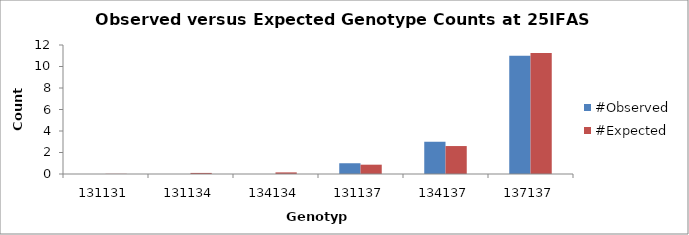
| Category | #Observed | #Expected |
|---|---|---|
| 131131.0 | 0 | 0.017 |
| 131134.0 | 0 | 0.1 |
| 134134.0 | 0 | 0.15 |
| 131137.0 | 1 | 0.867 |
| 134137.0 | 3 | 2.6 |
| 137137.0 | 11 | 11.267 |